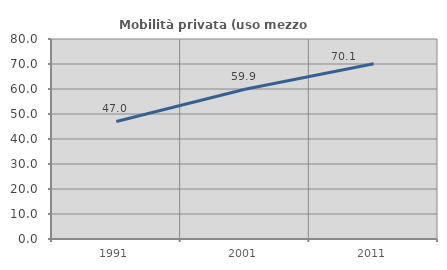
| Category | Mobilità privata (uso mezzo privato) |
|---|---|
| 1991.0 | 47.004 |
| 2001.0 | 59.911 |
| 2011.0 | 70.125 |